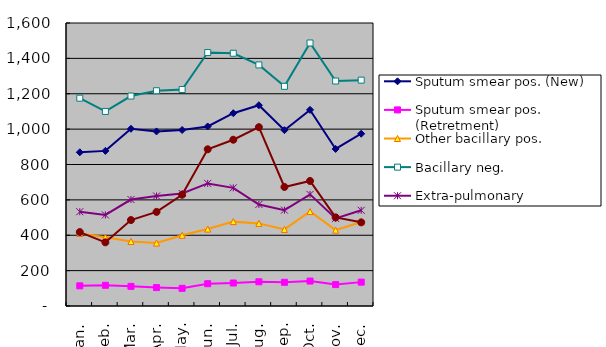
| Category | Sputum smear pos. (New) | Sputum smear pos. (Retretment) | Other bacillary pos. | Bacillary neg. | Extra-pulmonary | Chemopro-phylaxis* |
|---|---|---|---|---|---|---|
| Jan. | 869 | 114 | 410 | 1175 | 533 | 418 |
| Feb. | 877 | 117 | 389 | 1100 | 515 | 360 |
| Mar. | 1002 | 111 | 365 | 1187 | 602 | 486 |
| Apr. | 987 | 104 | 356 | 1217 | 622 | 532 |
| May. | 995 | 100 | 400 | 1224 | 636 | 629 |
| Jun. | 1015 | 126 | 435 | 1433 | 693 | 886 |
| Jul. | 1090 | 130 | 477 | 1429 | 668 | 940 |
| Aug. | 1135 | 137 | 467 | 1363 | 574 | 1011 |
| Sep. | 994 | 134 | 433 | 1242 | 542 | 673 |
| Oct. | 1109 | 141 | 534 | 1487 | 631 | 707 |
| Nov. | 888 | 121 | 429 | 1272 | 495 | 501 |
| Dec. | 974 | 135 | 475 | 1277 | 541 | 473 |